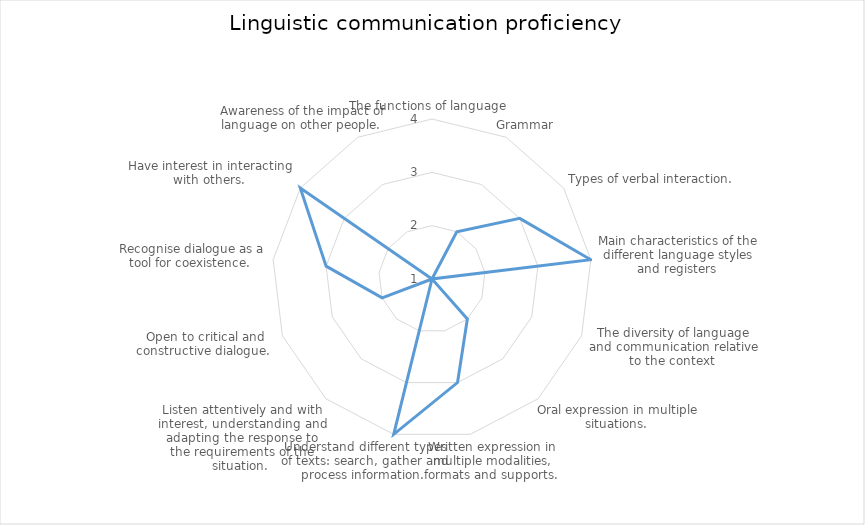
| Category | Series 0 |
|---|---|
| The functions of language  | 1 |
| Grammar  | 2 |
| Types of verbal interaction.  | 3 |
| Main characteristics of the different language styles and registers  | 4 |
| The diversity of language and communication relative to the context  | 1 |
| Oral expression in multiple situations.  | 2 |
| Written expression in multiple modalities, formats and supports.  | 3 |
| Understand different types of texts: search, gather and process information.  | 4 |
| Listen attentively and with interest, understanding and adapting the response to the requirements of the situation.  | 1 |
| Open to critical and constructive dialogue.  | 2 |
| Recognise dialogue as a tool for coexistence.  | 3 |
| Have interest in interacting with others.  | 4 |
| Awareness of the impact of language on other people.  | 1 |